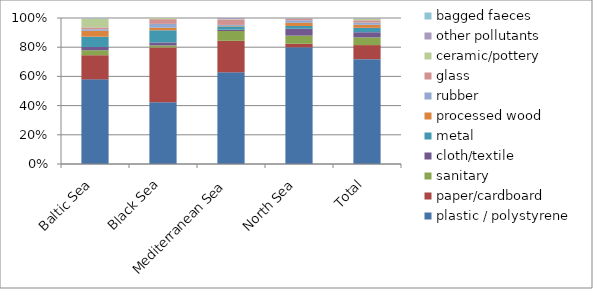
| Category | plastic / polystyrene | paper/cardboard | sanitary | cloth/textile | metal | processed wood | rubber | glass | ceramic/pottery | other pollutants | bagged faeces |
|---|---|---|---|---|---|---|---|---|---|---|---|
| Baltic Sea | 12283 | 3505 | 719 | 479 | 1484 | 850 | 237 | 272 | 1277 | 35 | 49 |
| Black Sea | 2702 | 2398 | 86 | 133 | 531 | 108 | 172 | 208 | 49 | 0 | 0 |
| Mediterranean Sea | 16323 | 5604 | 1750 | 232 | 588 | 82 | 174 | 958 | 68 | 204 | 4 |
| North Sea | 70533 | 2153 | 4902 | 4167 | 1674 | 1916 | 1517 | 843 | 186 | 300 | 56 |
| Total | 101841 | 13660 | 7457 | 5011 | 4277 | 2956 | 2100 | 2281 | 1580 | 539 | 109 |